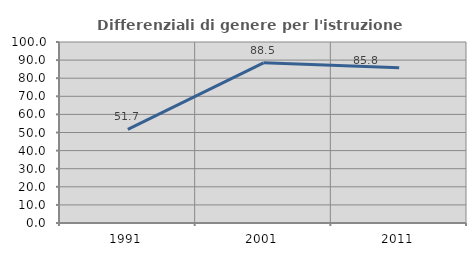
| Category | Differenziali di genere per l'istruzione superiore |
|---|---|
| 1991.0 | 51.717 |
| 2001.0 | 88.494 |
| 2011.0 | 85.755 |